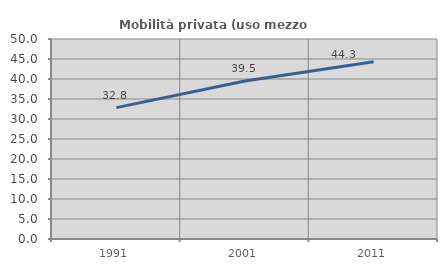
| Category | Mobilità privata (uso mezzo privato) |
|---|---|
| 1991.0 | 32.842 |
| 2001.0 | 39.498 |
| 2011.0 | 44.307 |